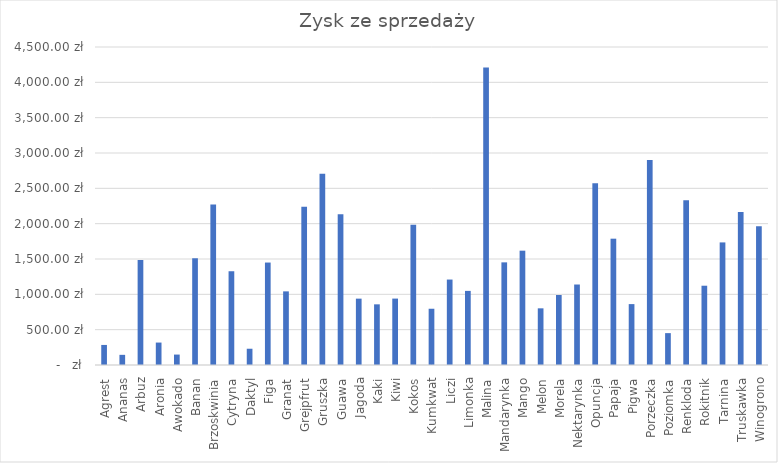
| Category |  Zysk ze sprzedaży  |
|---|---|
| Agrest | 283.8 |
| Ananas | 143.84 |
| Arbuz | 1486.08 |
| Aronia | 317.58 |
| Awokado | 147.6 |
| Banan | 1510.5 |
| Brzoskwinia | 2272.11 |
| Cytryna | 1326.75 |
| Daktyl | 230.16 |
| Figa | 1449.78 |
| Granat | 1041.9 |
| Grejpfrut | 2240.28 |
| Gruszka | 2706.18 |
| Guawa | 2132.48 |
| Jagoda | 939 |
| Kaki | 858.48 |
| Kiwi | 939.84 |
| Kokos | 1985.92 |
| Kumkwat | 795.96 |
| Liczi | 1209.16 |
| Limonka | 1048.75 |
| Malina | 4209.68 |
| Mandarynka | 1452.5 |
| Mango | 1617.77 |
| Melon | 801.9 |
| Morela | 990.36 |
| Nektarynka | 1139.06 |
| Opuncja | 2571.53 |
| Papaja | 1787.46 |
| Pigwa | 861.72 |
| Porzeczka | 2899.26 |
| Poziomka | 451.01 |
| Renkloda | 2330.16 |
| Rokitnik | 1121.9 |
| Tarnina | 1734.76 |
| Truskawka | 2163.65 |
| Winogrono | 1962.36 |